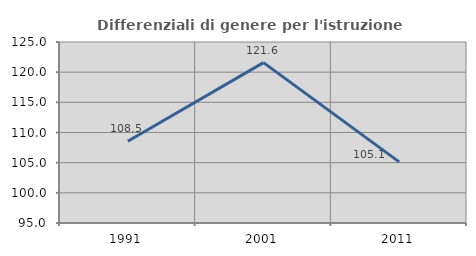
| Category | Differenziali di genere per l'istruzione superiore |
|---|---|
| 1991.0 | 108.542 |
| 2001.0 | 121.586 |
| 2011.0 | 105.132 |